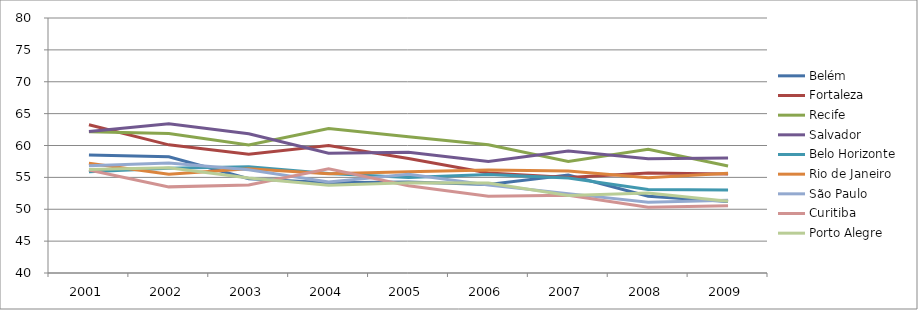
| Category | Belém | Fortaleza | Recife | Salvador | Belo Horizonte | Rio de Janeiro | São Paulo | Curitiba | Porto Alegre |
|---|---|---|---|---|---|---|---|---|---|
| 2001.0 | 58.51 | 63.26 | 62.17 | 62.2 | 55.87 | 57.21 | 56.81 | 56.17 | 56.25 |
| 2002.0 | 58.22 | 60.1 | 61.88 | 63.42 | 56.43 | 55.48 | 57.26 | 53.51 | 56.5 |
| 2003.0 | 54.78 | 58.63 | 60.08 | 61.85 | 56.65 | 56.36 | 56.19 | 53.79 | 54.91 |
| 2004.0 | 54.16 | 59.98 | 62.68 | 58.79 | 55.6 | 55.55 | 54.26 | 56.34 | 53.76 |
| 2005.0 | 54.28 | 57.95 | 61.39 | 58.93 | 54.98 | 55.88 | 55.47 | 53.69 | 54.15 |
| 2006.0 | 53.89 | 55.68 | 60.12 | 57.5 | 55.44 | 56.15 | 53.81 | 52.05 | 54.13 |
| 2007.0 | 55.37 | 54.99 | 57.5 | 59.15 | 54.89 | 55.99 | 52.45 | 52.18 | 52.17 |
| 2008.0 | 52.04 | 55.67 | 59.41 | 57.92 | 53.11 | 54.94 | 51.11 | 50.31 | 52.55 |
| 2009.0 | 51.22 | 55.53 | 56.78 | 58.03 | 53.02 | 55.64 | 51.42 | 50.53 | 51.26 |